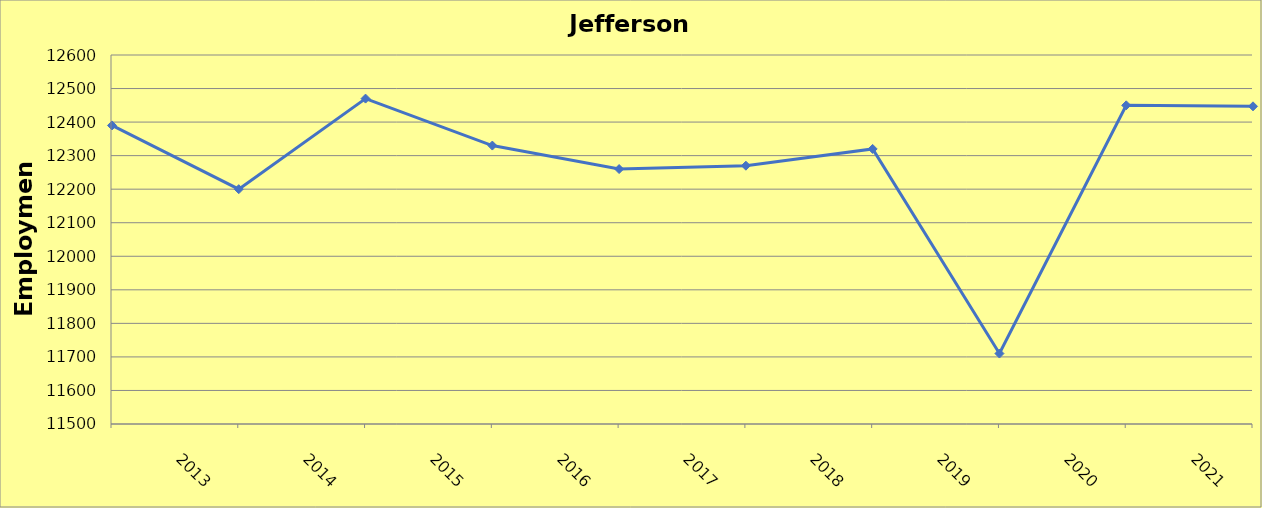
| Category | Jefferson County |
|---|---|
| 2013.0 | 12390 |
| 2014.0 | 12200 |
| 2015.0 | 12470 |
| 2016.0 | 12330 |
| 2017.0 | 12260 |
| 2018.0 | 12270 |
| 2019.0 | 12320 |
| 2020.0 | 11710 |
| 2021.0 | 12450 |
| 2022.0 | 12447 |